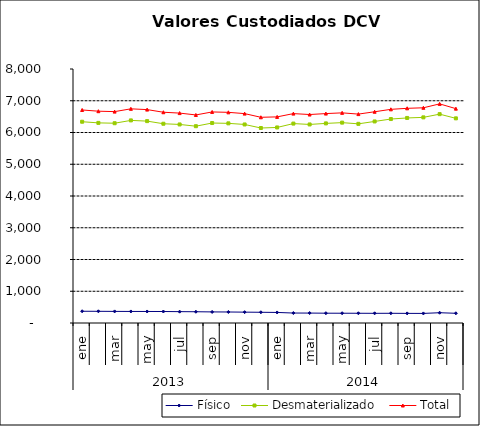
| Category | Físico | Desmaterializado | Total |
|---|---|---|---|
| 0 | 369.968 | 6339.304 | 6709.272 |
| 1900-01-01 | 368.222 | 6302.701 | 6670.922 |
| 1900-01-02 | 365.243 | 6292.27 | 6657.513 |
| 1900-01-03 | 364.126 | 6381.05 | 6745.176 |
| 1900-01-04 | 362.85 | 6358.399 | 6721.25 |
| 1900-01-05 | 362.153 | 6275.895 | 6638.048 |
| 1900-01-06 | 357.445 | 6253.685 | 6611.129 |
| 1900-01-07 | 354.497 | 6198.341 | 6552.838 |
| 1900-01-08 | 349.045 | 6298.52 | 6647.565 |
| 1900-01-09 | 346.635 | 6288.351 | 6634.986 |
| 1900-01-10 | 341.656 | 6253.29 | 6594.946 |
| 1900-01-11 | 337.66 | 6141.51 | 6479.17 |
| 1900-01-12 | 332.362 | 6159.445 | 6491.806 |
| 1900-01-13 | 313.875 | 6280.813 | 6594.688 |
| 1900-01-14 | 312.507 | 6253.467 | 6565.974 |
| 1900-01-15 | 308.893 | 6286.819 | 6595.713 |
| 1900-01-16 | 307.987 | 6310.993 | 6618.981 |
| 1900-01-17 | 306.686 | 6272.814 | 6579.5 |
| 1900-01-18 | 304.818 | 6348.411 | 6653.228 |
| 1900-01-19 | 305.689 | 6423.945 | 6729.634 |
| 1900-01-20 | 303.086 | 6458.4 | 6761.485 |
| 1900-01-21 | 301.754 | 6476.745 | 6778.499 |
| 1900-01-22 | 323.647 | 6577.862 | 6901.508 |
| 1900-01-23 | 305.676 | 6445.378 | 6751.054 |